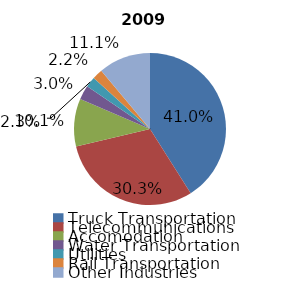
| Category | Series 0 |
|---|---|
| Truck Transportation | 1314 |
| Telecommunications | 971 |
| Accomodation | 325 |
| Water Transportation | 97 |
| Utilities | 72 |
| Rail Transportation | 70 |
| Other Industries | 355 |